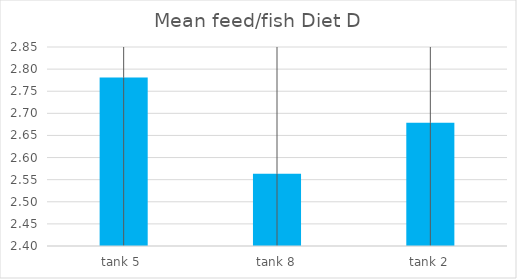
| Category | Diet D |
|---|---|
| tank 5  | 2.781 |
| tank 8 | 2.564 |
| tank 2 | 2.678 |